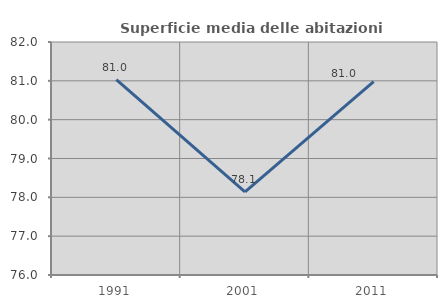
| Category | Superficie media delle abitazioni occupate |
|---|---|
| 1991.0 | 81.033 |
| 2001.0 | 78.142 |
| 2011.0 | 80.981 |